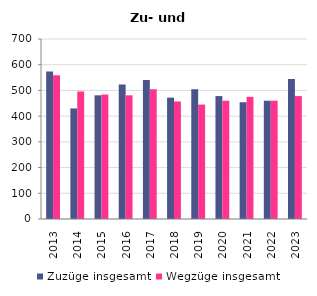
| Category | Zuzüge insgesamt | Wegzüge insgesamt |
|---|---|---|
| 2013.0 | 574 | 559 |
| 2014.0 | 430 | 496 |
| 2015.0 | 481 | 484 |
| 2016.0 | 523 | 481 |
| 2017.0 | 541 | 505 |
| 2018.0 | 472 | 457 |
| 2019.0 | 505 | 445 |
| 2020.0 | 478 | 460 |
| 2021.0 | 454 | 475 |
| 2022.0 | 460 | 460 |
| 2023.0 | 544 | 478 |